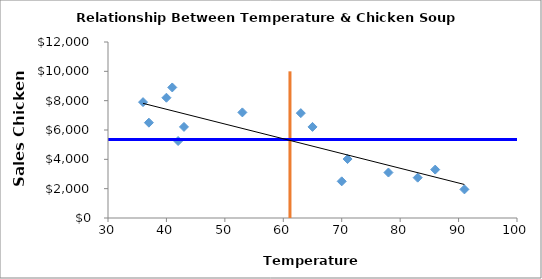
| Category | Sales Chicken Soup |
|---|---|
| 86.0 | 3300 |
| 40.0 | 8200 |
| 41.0 | 8900 |
| 78.0 | 3100 |
| 71.0 | 4020 |
| 91.0 | 1950 |
| 70.0 | 2500 |
| 37.0 | 6500 |
| 65.0 | 6210 |
| 42.0 | 5250 |
| 53.0 | 7200 |
| 83.0 | 2750 |
| 63.0 | 7150 |
| 36.0 | 7900 |
| 43.0 | 6210 |